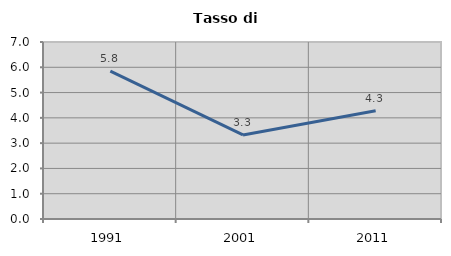
| Category | Tasso di disoccupazione   |
|---|---|
| 1991.0 | 5.848 |
| 2001.0 | 3.326 |
| 2011.0 | 4.283 |